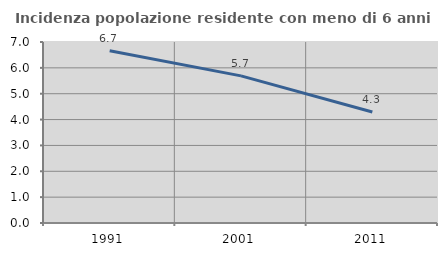
| Category | Incidenza popolazione residente con meno di 6 anni |
|---|---|
| 1991.0 | 6.662 |
| 2001.0 | 5.689 |
| 2011.0 | 4.292 |